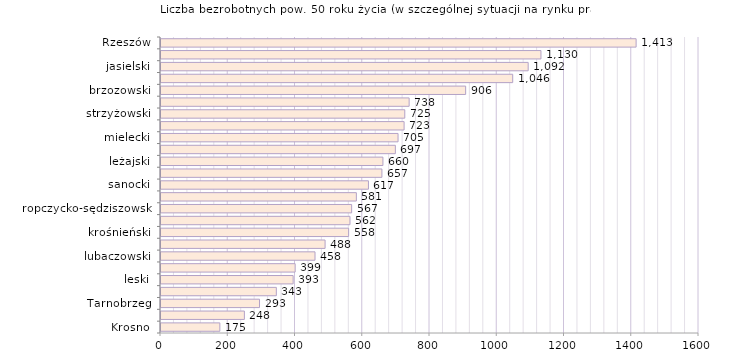
| Category | Liczba bezrobotnych powyżej 50 roku życia - w szczególnej sytuacji na rynku pracy |
|---|---|
| Krosno | 175 |
| bieszczadzki | 248 |
| Tarnobrzeg | 293 |
| tarnobrzeski  | 343 |
| leski | 393 |
| kolbuszowski | 399 |
| lubaczowski | 458 |
| stalowowolski | 488 |
| krośnieński | 558 |
| łańcucki | 562 |
| ropczycko-sędziszowski | 567 |
| dębicki | 581 |
| sanocki | 617 |
| przeworski | 657 |
| leżajski | 660 |
| przemyski | 697 |
| mielecki | 705 |
| Przemyśl | 723 |
| strzyżowski | 725 |
| niżański | 738 |
| brzozowski | 906 |
| jarosławski | 1046 |
| jasielski | 1092 |
| rzeszowski | 1130 |
| Rzeszów | 1413 |